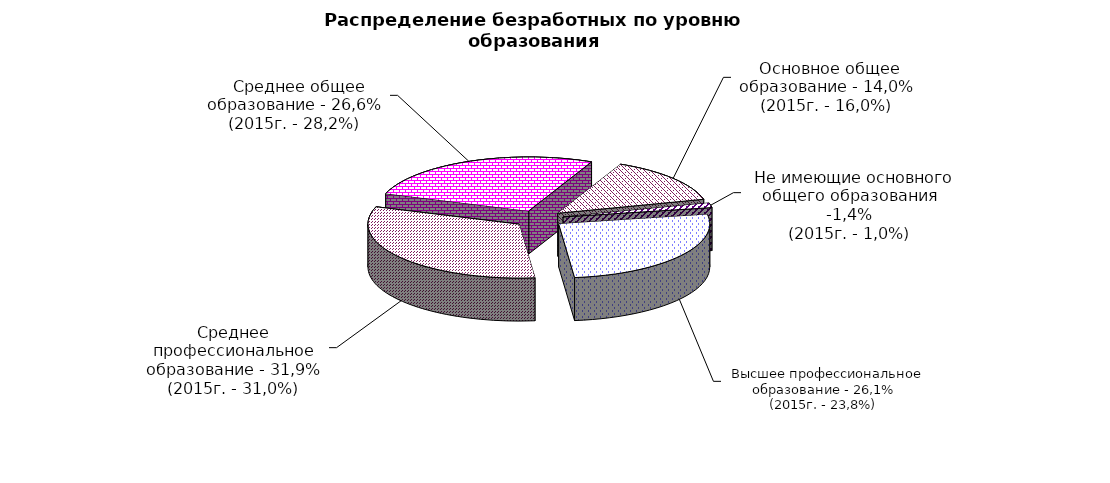
| Category | Series 0 |
|---|---|
|  - высшее образование | 26.1 |
|  - среднее профессиональное образование | 31.9 |
|  - среднее общее образование | 26.6 |
|  - основное общее образование | 14 |
|  - не имеющие основного общего образования | 1.4 |